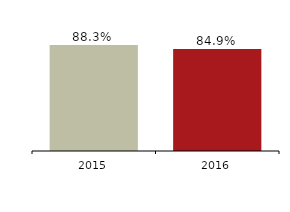
| Category | Deposit-to-loan ratio |
|---|---|
| 2016.0 | 0.849 |
| 2015.0 | 0.883 |